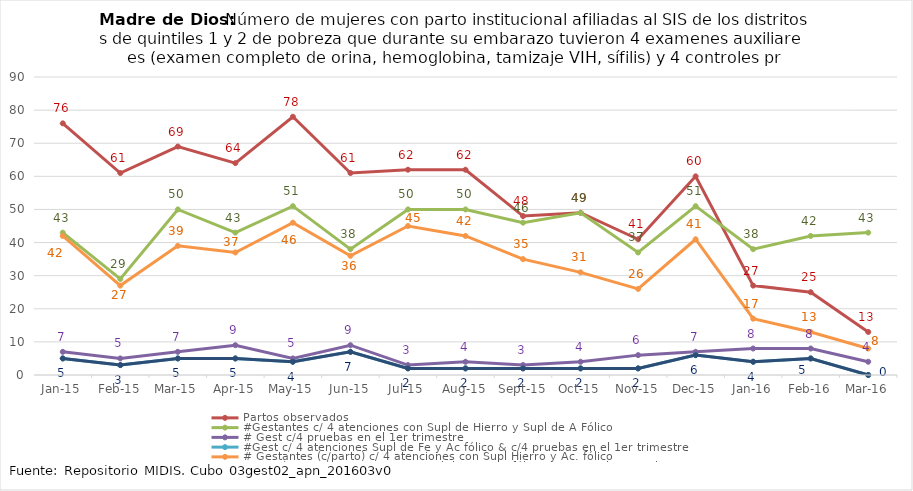
| Category | Partos observados | #Gestantes c/ 4 atenciones con Supl de Hierro y Supl de A Fólico | # Gest c/4 pruebas en el 1er trimestre | #Gest c/ 4 atenciones Supl de Fe y Ac fólico & c/4 pruebas en el 1er trimestre | # Gestantes (c/parto) c/ 4 atenciones con Supl Hierro y Ac. fólico | #Gest (c/parto) c/4 atenciones Supl de Fe y Ac fólico & c/4 pruebas en el 1er trimestre |
|---|---|---|---|---|---|---|
| 2015-01-01 | 76 | 43 | 7 | 5 | 42 | 5 |
| 2015-02-01 | 61 | 29 | 5 | 3 | 27 | 3 |
| 2015-03-01 | 69 | 50 | 7 | 5 | 39 | 5 |
| 2015-04-01 | 64 | 43 | 9 | 5 | 37 | 5 |
| 2015-05-01 | 78 | 51 | 5 | 4 | 46 | 4 |
| 2015-06-01 | 61 | 38 | 9 | 7 | 36 | 7 |
| 2015-07-01 | 62 | 50 | 3 | 2 | 45 | 2 |
| 2015-08-01 | 62 | 50 | 4 | 2 | 42 | 2 |
| 2015-09-01 | 48 | 46 | 3 | 2 | 35 | 2 |
| 2015-10-01 | 49 | 49 | 4 | 2 | 31 | 2 |
| 2015-11-01 | 41 | 37 | 6 | 2 | 26 | 2 |
| 2015-12-01 | 60 | 51 | 7 | 6 | 41 | 6 |
| 2016-01-01 | 27 | 38 | 8 | 4 | 17 | 4 |
| 2016-02-01 | 25 | 42 | 8 | 5 | 13 | 5 |
| 2016-03-01 | 13 | 43 | 4 | 0 | 8 | 0 |